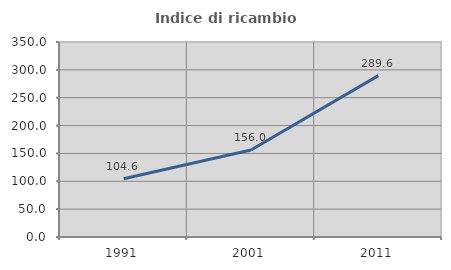
| Category | Indice di ricambio occupazionale  |
|---|---|
| 1991.0 | 104.609 |
| 2001.0 | 156.048 |
| 2011.0 | 289.583 |